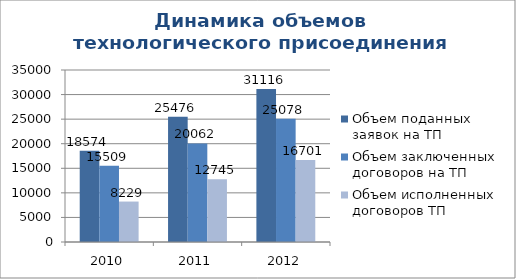
| Category | Объем поданных заявок на ТП | Объем заключенных договоров на ТП | Объем исполненных договоров ТП |
|---|---|---|---|
| 2010.0 | 18574 | 15509 | 8229 |
| 2011.0 | 25476 | 20062 | 12745 |
| 2012.0 | 31116 | 25078 | 16701 |